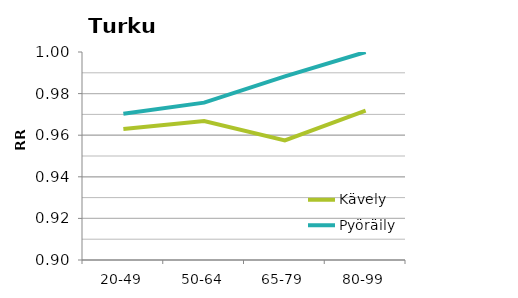
| Category | Kävely | Pyöräily |
|---|---|---|
| 20-49 | 0.963 | 0.97 |
| 50-64 | 0.967 | 0.976 |
| 65-79 | 0.957 | 0.988 |
| 80-99 | 0.972 | 1 |